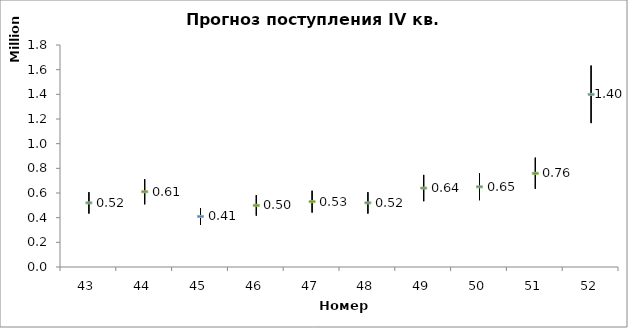
| Category | Верхняя граница | Нижняя граница | Прогноз поступлений |
|---|---|---|---|
| 43.0 | 606666.667 | 433333.333 | 520000 |
| 44.0 | 711666.667 | 508333.333 | 610000 |
| 45.0 | 478333.333 | 341666.667 | 410000 |
| 46.0 | 583333.333 | 416666.667 | 500000 |
| 47.0 | 618333.333 | 441666.667 | 530000 |
| 48.0 | 606666.667 | 433333.333 | 520000 |
| 49.0 | 746666.667 | 533333.333 | 640000 |
| 50.0 | 758333.333 | 541666.667 | 650000 |
| 51.0 | 886666.667 | 633333.333 | 760000 |
| 52.0 | 1633333.333 | 1166666.667 | 1400000 |